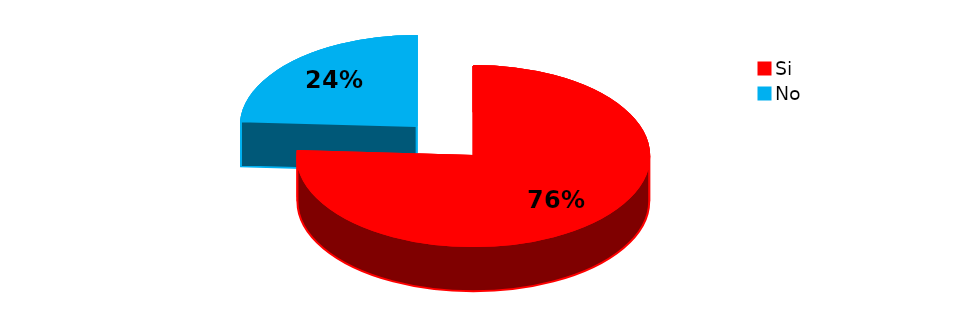
| Category | Series 0 |
|---|---|
| Si | 44 |
| No | 14 |